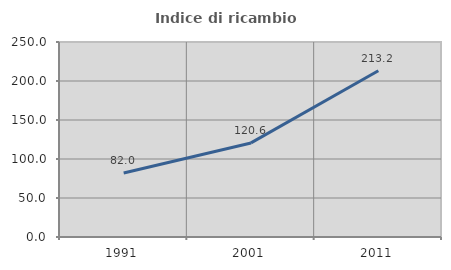
| Category | Indice di ricambio occupazionale  |
|---|---|
| 1991.0 | 82.022 |
| 2001.0 | 120.606 |
| 2011.0 | 213.158 |